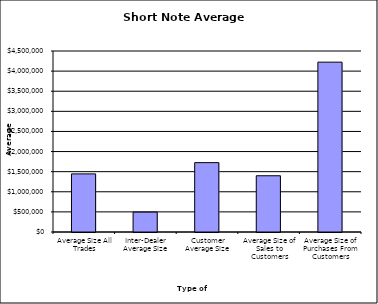
| Category | Security Type |
|---|---|
| Average Size All Trades | 1444830.81 |
| Inter-Dealer Average Size | 493915.179 |
| Customer Average Size | 1724732.389 |
| Average Size of Sales to Customers | 1398107.501 |
| Average Size of Purchases From Customers | 4222670.455 |